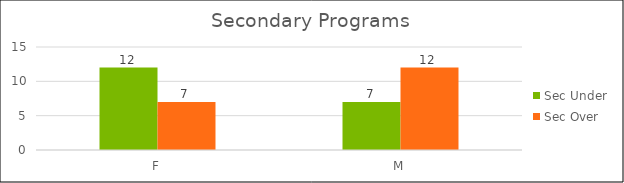
| Category | Sec Under | Sec Over |
|---|---|---|
| F | 12 | 7 |
| M | 7 | 12 |